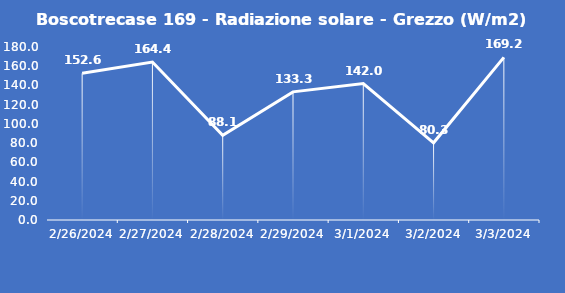
| Category | Boscotrecase 169 - Radiazione solare - Grezzo (W/m2) |
|---|---|
| 2/26/24 | 152.6 |
| 2/27/24 | 164.4 |
| 2/28/24 | 88.1 |
| 2/29/24 | 133.3 |
| 3/1/24 | 142 |
| 3/2/24 | 80.3 |
| 3/3/24 | 169.2 |